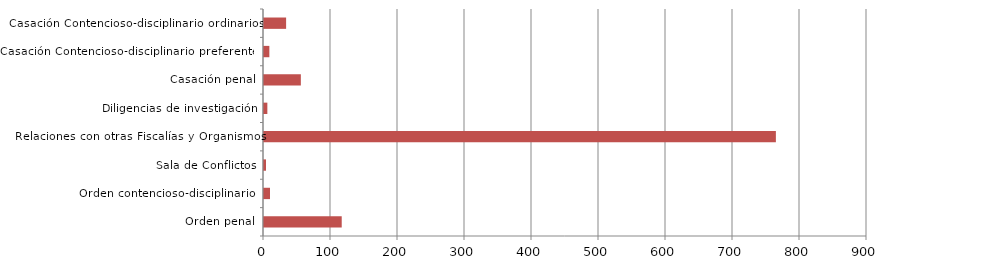
| Category | Series 1 |
|---|---|
| Orden penal | 116 |
| Orden contencioso-disciplinario  | 9 |
| Sala de Conflictos | 3 |
| Relaciones con otras Fiscalías y Organismos | 764 |
| Diligencias de investigación | 5 |
| Casación penal | 55 |
| Casación Contencioso-disciplinario preferentes | 8 |
| Casación Contencioso-disciplinario ordinarios | 33 |